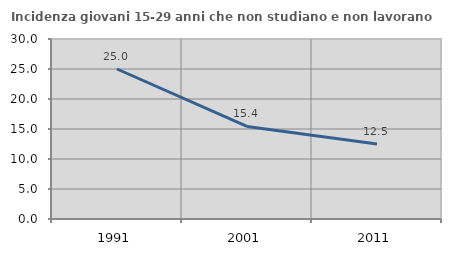
| Category | Incidenza giovani 15-29 anni che non studiano e non lavorano  |
|---|---|
| 1991.0 | 25 |
| 2001.0 | 15.426 |
| 2011.0 | 12.5 |